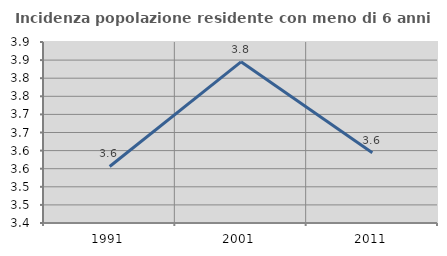
| Category | Incidenza popolazione residente con meno di 6 anni |
|---|---|
| 1991.0 | 3.556 |
| 2001.0 | 3.845 |
| 2011.0 | 3.594 |